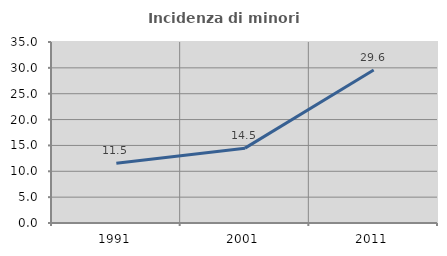
| Category | Incidenza di minori stranieri |
|---|---|
| 1991.0 | 11.538 |
| 2001.0 | 14.474 |
| 2011.0 | 29.592 |